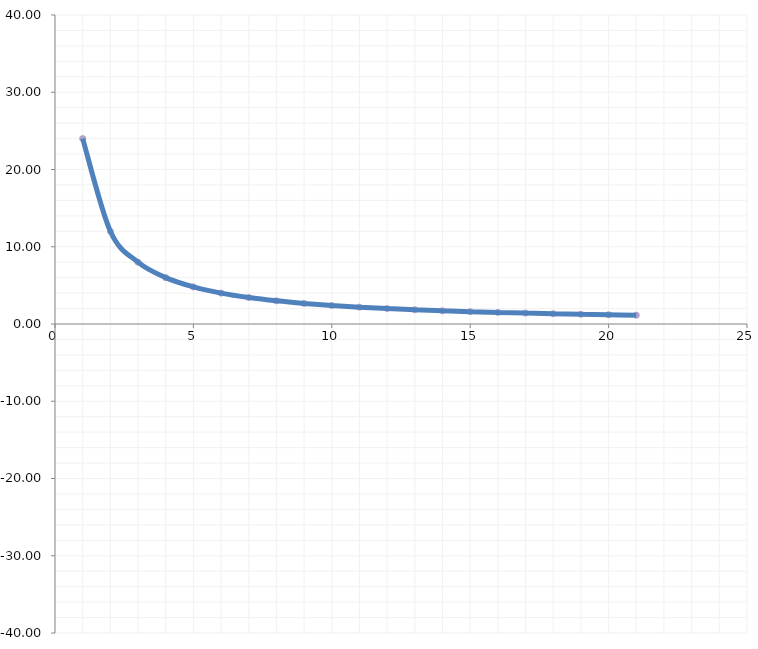
| Category | Series 0 |
|---|---|
| 1.0 | 24 |
| 2.0 | 12 |
| 3.0 | 8 |
| 4.0 | 6 |
| 5.0 | 4.8 |
| 6.0 | 4 |
| 7.0 | 3.429 |
| 8.0 | 3 |
| 9.0 | 2.667 |
| 10.0 | 2.4 |
| 11.0 | 2.182 |
| 12.0 | 2 |
| 13.0 | 1.846 |
| 14.0 | 1.714 |
| 15.0 | 1.6 |
| 16.0 | 1.5 |
| 17.0 | 1.412 |
| 18.0 | 1.333 |
| 19.0 | 1.263 |
| 20.0 | 1.2 |
| 21.0 | 1.143 |